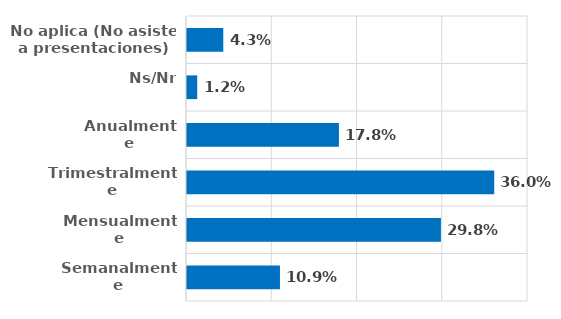
| Category | Series 0 |
|---|---|
| Semanalmente | 0.109 |
| Mensualmente | 0.298 |
| Trimestralmente | 0.36 |
| Anualmente | 0.178 |
| Ns/Nr | 0.012 |
| No aplica (No asiste a presentaciones) | 0.043 |